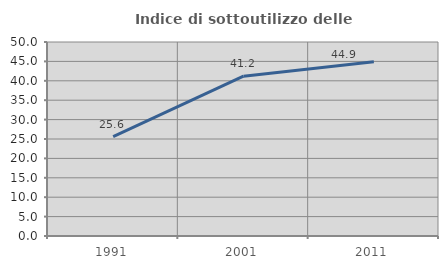
| Category | Indice di sottoutilizzo delle abitazioni  |
|---|---|
| 1991.0 | 25.588 |
| 2001.0 | 41.176 |
| 2011.0 | 44.924 |